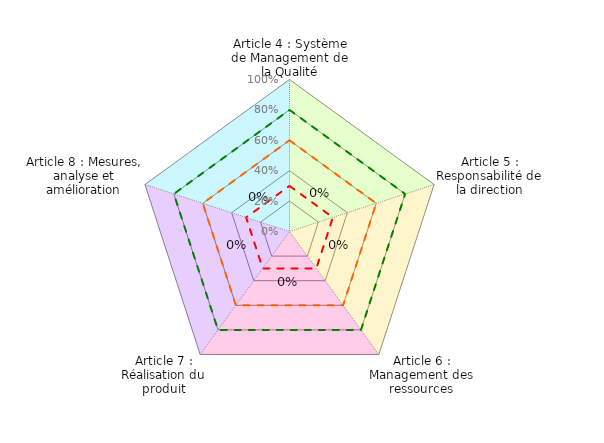
| Category | Coloriage Art4 | Coloriage Art5 | Coloriage Art6 | Coloriage Art7 | Coloriage Art8 | Conforme | Convaincant | Informel | Evaluation Mutuelle |
|---|---|---|---|---|---|---|---|---|---|
| Article 4 : Système de Management de la Qualité | 1 | 0 | 0 | 0 | 1 | 0.8 | 0.6 | 0.3 | 0 |
| Article 5 : Responsabilité de la direction | 1 | 1 | 0 | 0 | 0 | 0.8 | 0.6 | 0.3 | 0 |
| Article 6 : Management des ressources | 0 | 1 | 1 | 0 | 0 | 0.8 | 0.6 | 0.3 | 0 |
| Article 7 : Réalisation du produit | 0 | 0 | 1 | 1 | 0 | 0.8 | 0.6 | 0.3 | 0 |
| Article 8 : Mesures, analyse et amélioration | 0 | 0 | 0 | 1 | 1 | 0.8 | 0.6 | 0.3 | 0 |